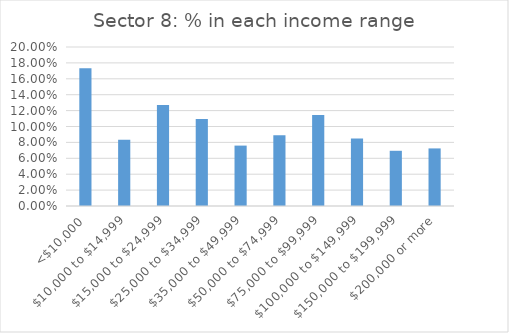
| Category | Series 0 |
|---|---|
| <$10,000 | 0.173 |
| $10,000 to $14,999 | 0.083 |
| $15,000 to $24,999 | 0.127 |
| $25,000 to $34,999 | 0.11 |
| $35,000 to $49,999 | 0.076 |
| $50,000 to $74,999 | 0.089 |
| $75,000 to $99,999 | 0.114 |
| $100,000 to $149,999 | 0.085 |
| $150,000 to $199,999 | 0.069 |
| $200,000 or more | 0.072 |